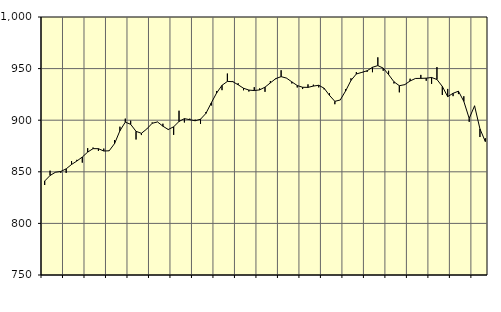
| Category | Piggar | Series 1 |
|---|---|---|
| nan | 837.2 | 841.06 |
| 1.0 | 851.1 | 846.41 |
| 1.0 | 849.7 | 849.55 |
| 1.0 | 849.1 | 850.34 |
| nan | 848.9 | 852.86 |
| 2.0 | 860.4 | 857.1 |
| 2.0 | 861.6 | 860.46 |
| 2.0 | 858.9 | 864.3 |
| nan | 872.9 | 869.09 |
| 3.0 | 873.5 | 872.45 |
| 3.0 | 870.3 | 872.39 |
| 3.0 | 872.5 | 870.13 |
| nan | 870.6 | 870.34 |
| 4.0 | 880.8 | 877.29 |
| 4.0 | 893.7 | 889.75 |
| 4.0 | 901.5 | 898.12 |
| nan | 899.5 | 896 |
| 5.0 | 881.3 | 889.21 |
| 5.0 | 885.6 | 887.3 |
| 5.0 | 891.4 | 891.49 |
| nan | 897.8 | 897 |
| 6.0 | 898.4 | 898.31 |
| 6.0 | 896.6 | 894.19 |
| 6.0 | 890.5 | 890.98 |
| nan | 885.8 | 893.61 |
| 7.0 | 909.2 | 898.78 |
| 7.0 | 897.8 | 901.5 |
| 7.0 | 901.5 | 900.51 |
| nan | 900.5 | 899.45 |
| 8.0 | 896.4 | 900.97 |
| 8.0 | 907.9 | 906.56 |
| 8.0 | 914.2 | 916.73 |
| nan | 928.3 | 926.4 |
| 9.0 | 929.1 | 933.8 |
| 9.0 | 945.2 | 937.59 |
| 9.0 | 938 | 937.34 |
| nan | 935.8 | 934.34 |
| 10.0 | 929 | 930.95 |
| 10.0 | 927.8 | 929.19 |
| 10.0 | 932 | 928.72 |
| nan | 930.8 | 929.37 |
| 11.0 | 927.5 | 932.01 |
| 11.0 | 937.9 | 936.18 |
| 11.0 | 939.8 | 940.28 |
| nan | 948.4 | 942.22 |
| 12.0 | 940.9 | 940.8 |
| 12.0 | 935.6 | 937.13 |
| 12.0 | 931.7 | 933.6 |
| nan | 930.2 | 931.9 |
| 13.0 | 934.7 | 931.81 |
| 13.0 | 934.4 | 933.05 |
| 13.0 | 931.8 | 933.84 |
| nan | 929.9 | 930.98 |
| 14.0 | 926.1 | 924.1 |
| 14.0 | 915.5 | 918.27 |
| 14.0 | 919.5 | 919.59 |
| nan | 930.1 | 928.33 |
| 15.0 | 940.6 | 938.53 |
| 15.0 | 946.6 | 944.79 |
| 15.0 | 945.9 | 946.3 |
| nan | 946.8 | 947.89 |
| 16.0 | 946.5 | 951.29 |
| 16.0 | 960.9 | 952.9 |
| 16.0 | 947.9 | 950.46 |
| nan | 947.9 | 944.22 |
| 17.0 | 935.6 | 937.23 |
| 17.0 | 927 | 933.42 |
| 17.0 | 934.8 | 934.43 |
| nan | 940.2 | 938.01 |
| 18.0 | 940.6 | 940.45 |
| 18.0 | 943.9 | 940.54 |
| 18.0 | 938.2 | 940.71 |
| nan | 935.2 | 941.4 |
| 19.0 | 951.5 | 939.44 |
| 19.0 | 924.5 | 932.74 |
| 19.0 | 930.3 | 922.85 |
| nan | 923.3 | 926.06 |
| 20.0 | 925.3 | 928.11 |
| 20.0 | 923.2 | 918.25 |
| 20.0 | 898.4 | 901.74 |
| nan | 913.5 | 913.91 |
| 21.0 | 883.7 | 891.61 |
| 21.0 | 882.5 | 879.3 |